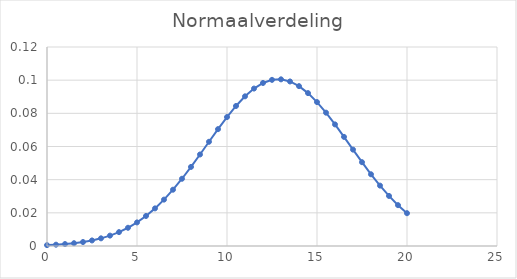
| Category | normverd |
|---|---|
| 0.0 | 0.001 |
| 0.5 | 0.001 |
| 1.0 | 0.001 |
| 1.5 | 0.002 |
| 2.0 | 0.002 |
| 2.5 | 0.003 |
| 3.0 | 0.005 |
| 3.5 | 0.006 |
| 4.0 | 0.008 |
| 4.5 | 0.011 |
| 5.0 | 0.014 |
| 5.5 | 0.018 |
| 6.0 | 0.023 |
| 6.5 | 0.028 |
| 7.0 | 0.034 |
| 7.5 | 0.041 |
| 8.0 | 0.048 |
| 8.5 | 0.055 |
| 9.0 | 0.063 |
| 9.5 | 0.07 |
| 10.0 | 0.078 |
| 10.5 | 0.084 |
| 11.0 | 0.09 |
| 11.5 | 0.095 |
| 12.0 | 0.098 |
| 12.5 | 0.1 |
| 13.0 | 0.1 |
| 13.5 | 0.099 |
| 14.0 | 0.096 |
| 14.5 | 0.092 |
| 15.0 | 0.087 |
| 15.5 | 0.08 |
| 16.0 | 0.073 |
| 16.5 | 0.066 |
| 17.0 | 0.058 |
| 17.5 | 0.051 |
| 18.0 | 0.043 |
| 18.5 | 0.036 |
| 19.0 | 0.03 |
| 19.5 | 0.025 |
| 20.0 | 0.02 |